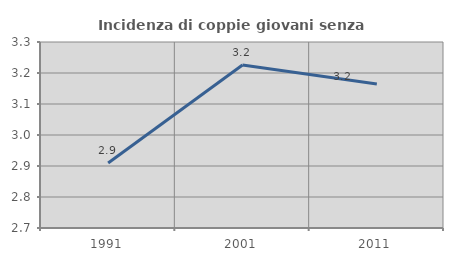
| Category | Incidenza di coppie giovani senza figli |
|---|---|
| 1991.0 | 2.91 |
| 2001.0 | 3.226 |
| 2011.0 | 3.165 |